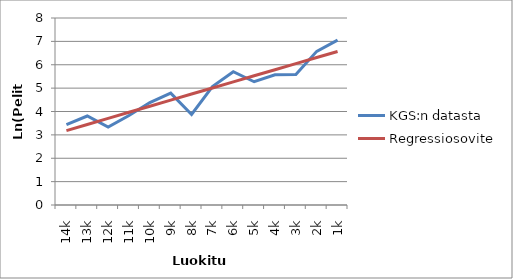
| Category | KGS:n datasta | Regressiosovite |
|---|---|---|
| 14k | 3.434 | 3.184 |
| 13k | 3.807 | 3.445 |
| 12k | 3.332 | 3.705 |
| 11k | 3.829 | 3.965 |
| 10k | 4.382 | 4.226 |
| 9k | 4.787 | 4.486 |
| 8k | 3.871 | 4.746 |
| 7k | 5.069 | 5.007 |
| 6k | 5.704 | 5.267 |
| 5k | 5.273 | 5.527 |
| 4k | 5.568 | 5.788 |
| 3k | 5.587 | 6.048 |
| 2k | 6.574 | 6.308 |
| 1k | 7.056 | 6.569 |